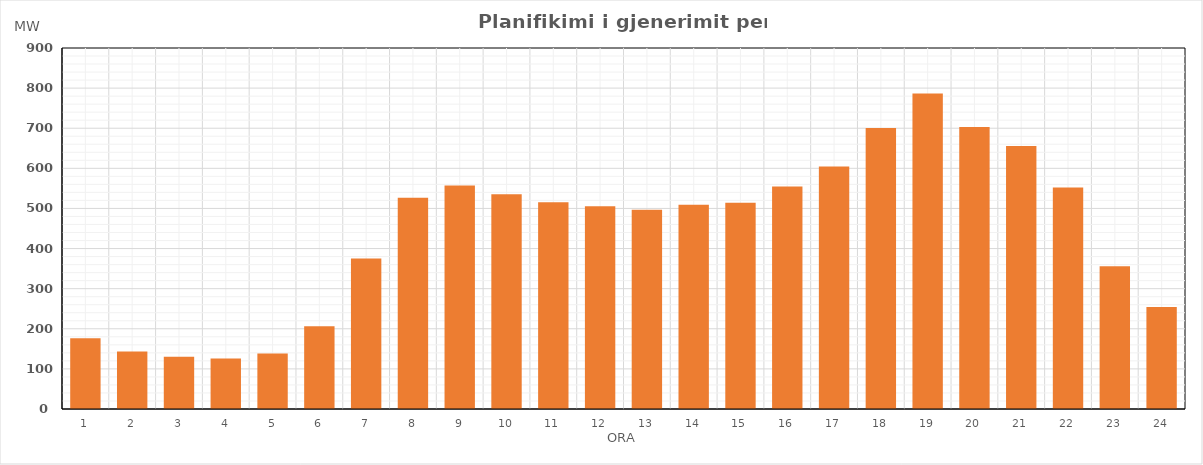
| Category | Max (MW) |
|---|---|
| 0 | 176.272 |
| 1 | 143.122 |
| 2 | 130.126 |
| 3 | 126.114 |
| 4 | 138.144 |
| 5 | 206.554 |
| 6 | 375.474 |
| 7 | 526.402 |
| 8 | 557.508 |
| 9 | 535.514 |
| 10 | 515.368 |
| 11 | 505.262 |
| 12 | 497 |
| 13 | 509.219 |
| 14 | 514.27 |
| 15 | 554.528 |
| 16 | 604.715 |
| 17 | 700.346 |
| 18 | 786.41 |
| 19 | 703.18 |
| 20 | 655.916 |
| 21 | 552.426 |
| 22 | 355.72 |
| 23 | 254.09 |